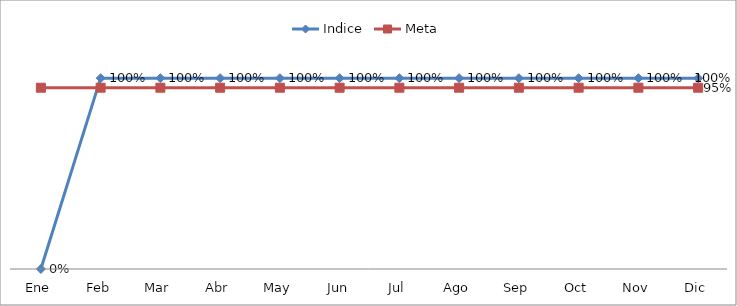
| Category | Indice | Meta |
|---|---|---|
| Ene | 0 | 0.95 |
| Feb | 1 | 0.95 |
| Mar | 1 | 0.95 |
| Abr | 1 | 0.95 |
| May | 1 | 0.95 |
| Jun | 1 | 0.95 |
| Jul | 1 | 0.95 |
| Ago | 1 | 0.95 |
| Sep | 1 | 0.95 |
| Oct | 1 | 0.95 |
| Nov | 1 | 0.95 |
| Dic | 1 | 0.95 |